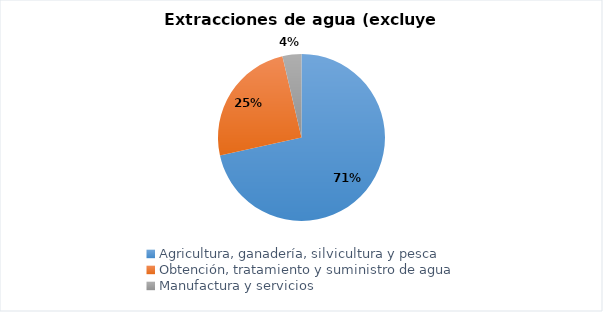
| Category | Series 0 |
|---|---|
| Agricultura, ganadería, silvicultura y pesca | 1672.837 |
| Obtención, tratamiento y suministro de agua | 579.558 |
| Manufactura y servicios | 85.926 |